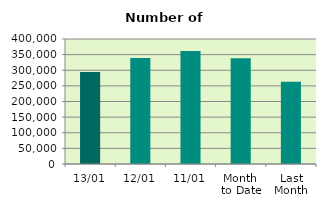
| Category | Series 0 |
|---|---|
| 13/01 | 294658 |
| 12/01 | 339318 |
| 11/01 | 361266 |
| Month 
to Date | 338769.111 |
| Last
Month | 263242 |